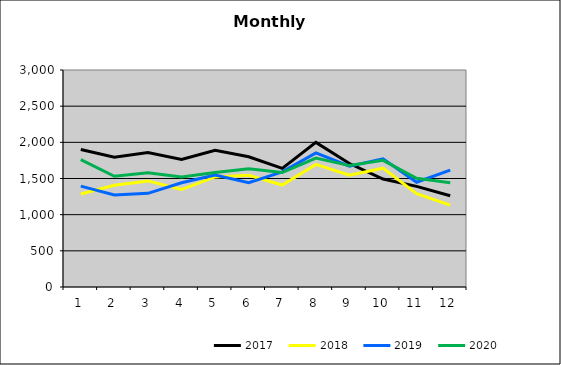
| Category | 2017 | 2018 | 2019 | 2020 |
|---|---|---|---|---|
| 0 | 1900.859 | 1286.21 | 1394.576 | 1762.064 |
| 1 | 1795.105 | 1406.556 | 1272.617 | 1530.829 |
| 2 | 1859.386 | 1466.695 | 1295.231 | 1579.085 |
| 3 | 1764.013 | 1347.408 | 1441.267 | 1520.386 |
| 4 | 1891.399 | 1522.181 | 1548.691 | 1581.8 |
| 5 | 1800.236 | 1543.945 | 1443.46 | 1634.409 |
| 6 | 1640.121 | 1409.491 | 1591.615 | 1582.785 |
| 7 | 1999.331 | 1694.901 | 1854.799 | 1783.031 |
| 8 | 1706.874 | 1545.104 | 1671.028 | 1678.417 |
| 9 | 1492.036 | 1642.816 | 1771.378 | 1751.194 |
| 10 | 1390.86 | 1288.934 | 1448.517 | 1503.037 |
| 11 | 1261.902 | 1131.485 | 1616.657 | 1439.988 |